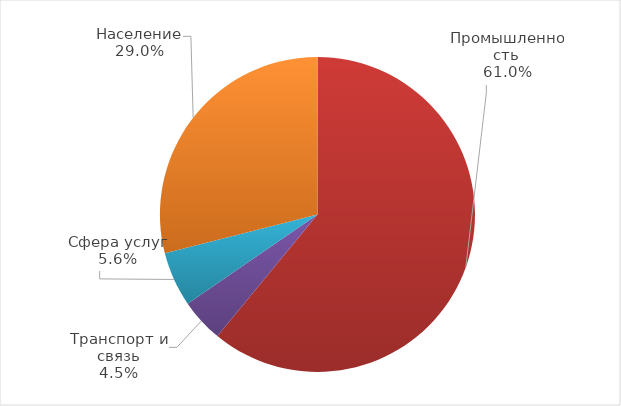
| Category | Series 0 |
|---|---|
| Сельское хозяйство | 0 |
| Промышленность | 96888.3 |
| Строительство | 0 |
| Транспорт и связь | 7097.9 |
| Сфера услуг | 8926.7 |
| Население | 46024.3 |